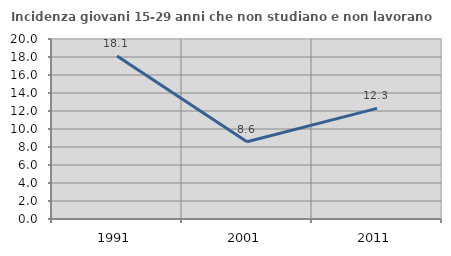
| Category | Incidenza giovani 15-29 anni che non studiano e non lavorano  |
|---|---|
| 1991.0 | 18.122 |
| 2001.0 | 8.58 |
| 2011.0 | 12.295 |